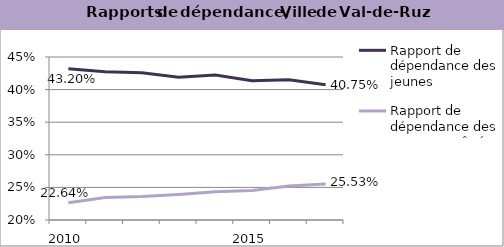
| Category | Rapport de dépendance des jeunes | Rapport de dépendance des personnes âgées |
|---|---|---|
| 2010.0 | 0.432 | 0.226 |
| 2011.0 | 0.428 | 0.234 |
| 2012.0 | 0.426 | 0.236 |
| 2013.0 | 0.419 | 0.239 |
| 2014.0 | 0.422 | 0.243 |
| 2015.0 | 0.413 | 0.245 |
| 2016.0 | 0.415 | 0.252 |
| 2017.0 | 0.408 | 0.255 |